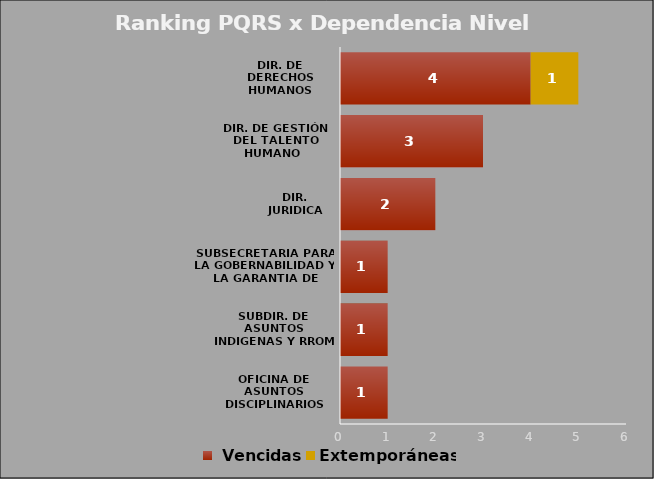
| Category |  Vencidas | Extemporáneas |
|---|---|---|
| OFICINA DE ASUNTOS DISCIPLINARIOS | 1 | 0 |
| SUBDIR. DE ASUNTOS INDIGENAS Y RROM | 1 | 0 |
| SUBSECRETARIA PARA LA GOBERNABILIDAD Y LA GARANTIA DE DERECHOS | 1 | 0 |
| DIR. JURIDICA | 2 | 0 |
| DIR. DE GESTIÓN DEL TALENTO HUMANO  | 3 | 0 |
| DIR. DE DERECHOS HUMANOS | 4 | 1 |